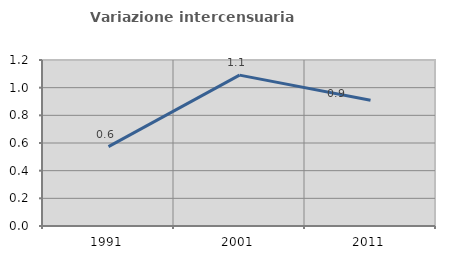
| Category | Variazione intercensuaria annua |
|---|---|
| 1991.0 | 0.574 |
| 2001.0 | 1.091 |
| 2011.0 | 0.908 |